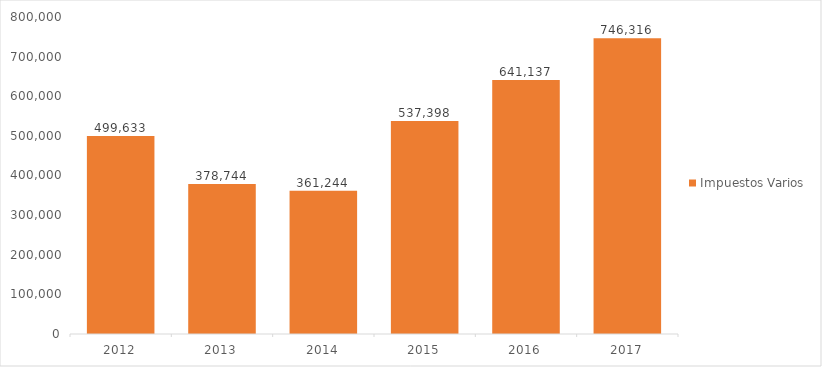
| Category | Impuestos Varios |
|---|---|
| 2012.0 | 499632.599 |
| 2013.0 | 378744.155 |
| 2014.0 | 361244.139 |
| 2015.0 | 537397.95 |
| 2016.0 | 641137.475 |
| 2017.0 | 746315.719 |